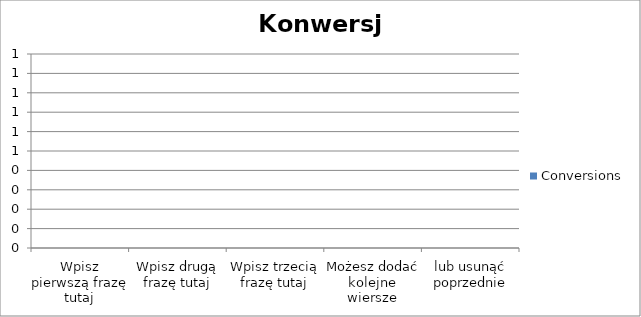
| Category | Conversions |
|---|---|
| Wpisz pierwszą frazę tutaj | 0 |
| Wpisz drugą frazę tutaj | 0 |
| Wpisz trzecią frazę tutaj | 0 |
| Możesz dodać kolejne wiersze | 0 |
| lub usunąć poprzednie | 0 |